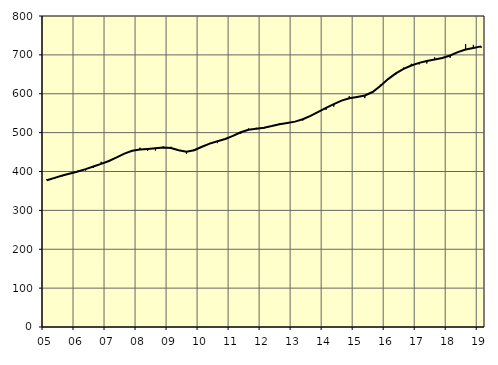
| Category | Trend | Originalvärden |
|---|---|---|
| 5.0 | 377.4 | 380.2 |
| nan | 383.57 | 381.1 |
| 6.0 | 389.87 | 387.8 |
| 6.0 | 394.97 | 395.4 |
| 6.0 | 399.89 | 402.6 |
| nan | 406 | 402.6 |
| 7.0 | 412.91 | 409.2 |
| 7.0 | 419.62 | 424.9 |
| 7.0 | 427.11 | 426 |
| nan | 436.24 | 434.7 |
| 8.0 | 445.91 | 445.3 |
| 8.0 | 453.18 | 452 |
| 8.0 | 456.72 | 461.2 |
| nan | 458.16 | 453.5 |
| 9.0 | 460.04 | 453.9 |
| 9.0 | 461.97 | 464.3 |
| 9.0 | 460.33 | 463.7 |
| nan | 454.79 | 453 |
| 10.0 | 451.14 | 445.4 |
| 10.0 | 454.8 | 457.6 |
| 10.0 | 463.69 | 462.6 |
| nan | 471.79 | 473.6 |
| 11.0 | 477.68 | 472.9 |
| 11.0 | 483.56 | 483 |
| 11.0 | 491.65 | 493.5 |
| nan | 500.97 | 497 |
| 12.0 | 507.32 | 510.6 |
| 12.0 | 510.25 | 512.5 |
| 12.0 | 512.7 | 510.5 |
| nan | 516.91 | 517.2 |
| 13.0 | 521.76 | 524.5 |
| 13.0 | 524.86 | 526.5 |
| 13.0 | 528.27 | 529.7 |
| nan | 534.46 | 531.2 |
| 14.0 | 542.94 | 544 |
| 14.0 | 553.12 | 554.4 |
| 14.0 | 563.44 | 558.4 |
| nan | 573.32 | 566.9 |
| 15.0 | 582.21 | 583.3 |
| 15.0 | 588.43 | 593.9 |
| 15.0 | 591.74 | 589.4 |
| nan | 595.44 | 588.7 |
| 16.0 | 604.46 | 602 |
| 16.0 | 620.16 | 623.3 |
| 16.0 | 637.65 | 637.6 |
| nan | 652.33 | 649.5 |
| 17.0 | 663.93 | 667.1 |
| 17.0 | 672.6 | 677.2 |
| 17.0 | 679.37 | 675.3 |
| nan | 684.34 | 677.8 |
| 18.0 | 687.86 | 693.8 |
| 18.0 | 691.93 | 694 |
| 18.0 | 698.4 | 692.3 |
| nan | 707 | 705.4 |
| 19.0 | 713.88 | 727.3 |
| 19.0 | 717.95 | 725.7 |
| 19.0 | 721.91 | 718.2 |